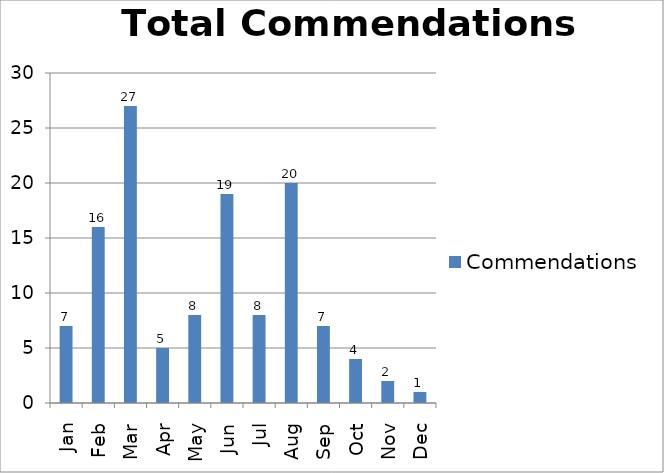
| Category | Commendations |
|---|---|
| Jan | 7 |
| Feb | 16 |
| Mar | 27 |
| Apr | 5 |
| May | 8 |
| Jun | 19 |
| Jul | 8 |
| Aug | 20 |
| Sep | 7 |
| Oct | 4 |
| Nov | 2 |
| Dec | 1 |